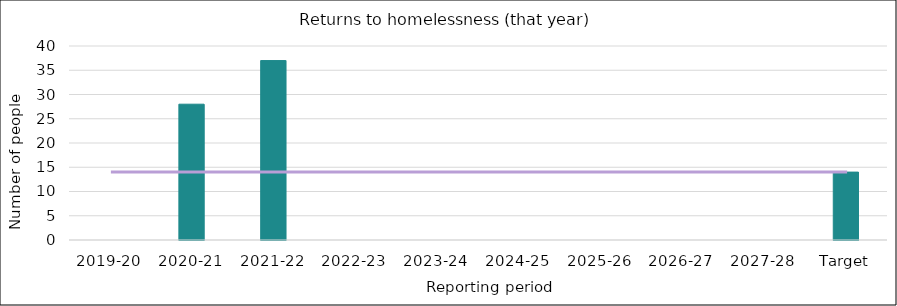
| Category | Series 0 |
|---|---|
| 2019-20 | 0 |
| 2020-21 | 28 |
| 2021-22 | 37 |
| 2022-23 | 0 |
| 2023-24 | 0 |
| 2024-25 | 0 |
| 2025-26 | 0 |
| 2026-27 | 0 |
| 2027-28 | 0 |
| Target | 14 |